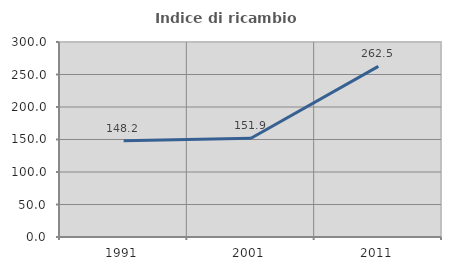
| Category | Indice di ricambio occupazionale  |
|---|---|
| 1991.0 | 148.187 |
| 2001.0 | 151.948 |
| 2011.0 | 262.5 |